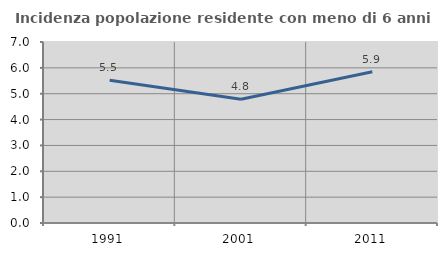
| Category | Incidenza popolazione residente con meno di 6 anni |
|---|---|
| 1991.0 | 5.524 |
| 2001.0 | 4.784 |
| 2011.0 | 5.851 |